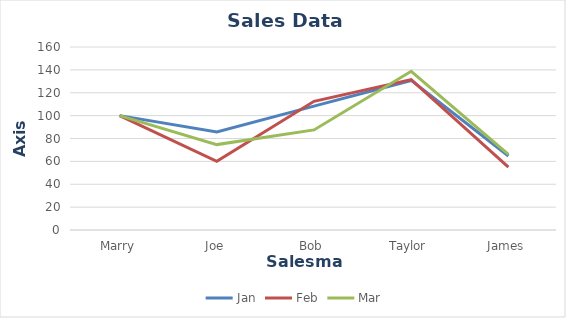
| Category | Jan | Feb | Mar |
|---|---|---|---|
| Marry | 100 | 100 | 100 |
| Joe | 85.714 | 60 | 74.667 |
| Bob | 108.333 | 112.5 | 87.5 |
| Taylor | 130.769 | 131.481 | 138.776 |
| James | 64.706 | 54.93 | 66.176 |